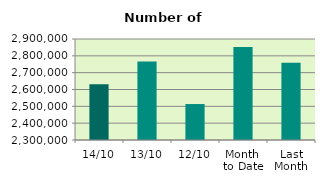
| Category | Series 0 |
|---|---|
| 14/10 | 2631824 |
| 13/10 | 2765700 |
| 12/10 | 2513634 |
| Month 
to Date | 2852019.6 |
| Last
Month | 2759252.364 |